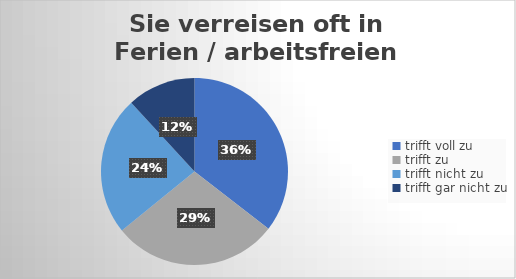
| Category | Sie verreisen oft in Ferien / arbeitsfreien Wochen  |
|---|---|
| trifft voll zu | 99 |
| trifft zu  | 80 |
| trifft nicht zu  | 67 |
| trifft gar nicht zu | 33 |